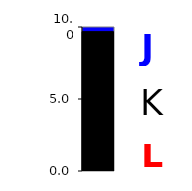
| Category | Series 0 |
|---|---|
| 0 | 9.678 |